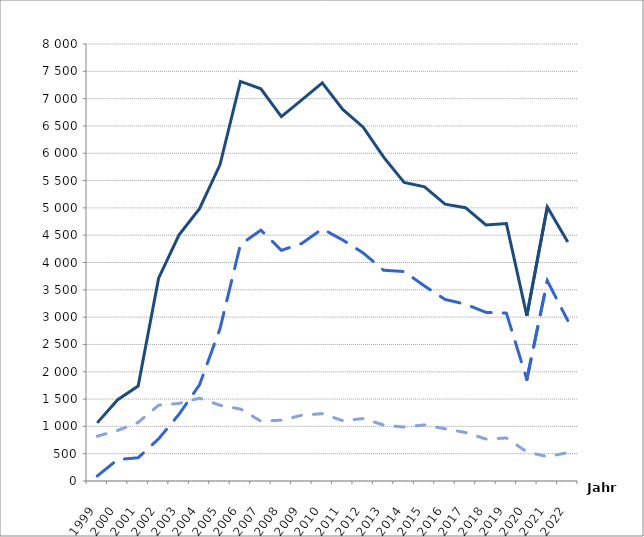
| Category | insgesamt | Unternehmen | Verbraucher:innen |
|---|---|---|---|
| 1999.0 | 1064 | 820 | 91 |
| 2000.0 | 1488 | 926 | 394 |
| 2001.0 | 1737 | 1072 | 425 |
| 2002.0 | 3712 | 1388 | 772 |
| 2003.0 | 4507 | 1420 | 1222 |
| 2004.0 | 4984 | 1516 | 1761 |
| 2005.0 | 5788 | 1387 | 2788 |
| 2006.0 | 7315 | 1317 | 4330 |
| 2007.0 | 7181 | 1095 | 4592 |
| 2008.0 | 6671 | 1114 | 4223 |
| 2009.0 | 6976 | 1203 | 4349 |
| 2010.0 | 7287 | 1233 | 4615 |
| 2011.0 | 6803 | 1104 | 4412 |
| 2012.0 | 6477 | 1143 | 4175 |
| 2013.0 | 5928 | 1026 | 3858 |
| 2014.0 | 5467 | 987 | 3835 |
| 2015.0 | 5384 | 1027 | 3569 |
| 2016.0 | 5067 | 956 | 3324 |
| 2017.0 | 5003 | 888 | 3237 |
| 2018.0 | 4688 | 768 | 3087 |
| 2019.0 | 4713 | 787 | 3073 |
| 2020.0 | 3024 | 534 | 1859 |
| 2021.0 | 5015 | 446 | 3665 |
| 2022.0 | 4376 | 520 | 2938 |